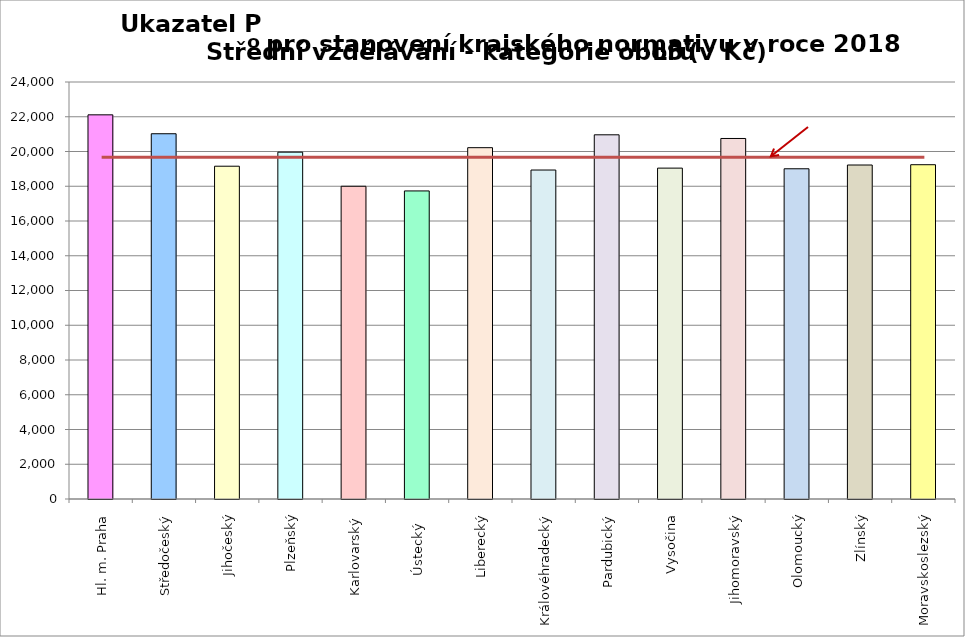
| Category | Series 0 |
|---|---|
| Hl. m. Praha | 22110 |
| Středočeský | 21022 |
| Jihočeský | 19153 |
| Plzeňský | 19962 |
| Karlovarský  | 18000 |
| Ústecký   | 17731 |
| Liberecký | 20220 |
| Královéhradecký | 18934 |
| Pardubický | 20961 |
| Vysočina | 19044 |
| Jihomoravský | 20750 |
| Olomoucký | 19006 |
| Zlínský | 19223 |
| Moravskoslezský | 19240 |